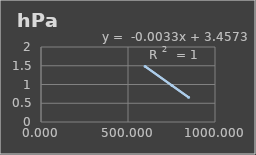
| Category | Presión Atmosférica |
|---|---|
| 598.082 | 1.483 |
| 752.795 | 0.973 |
| 848.6 | 0.656 |